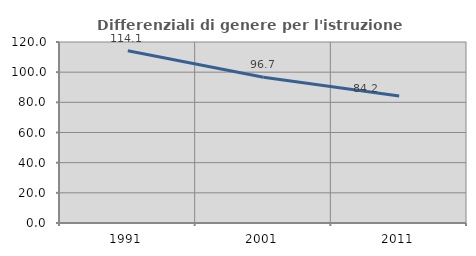
| Category | Differenziali di genere per l'istruzione superiore |
|---|---|
| 1991.0 | 114.147 |
| 2001.0 | 96.694 |
| 2011.0 | 84.238 |